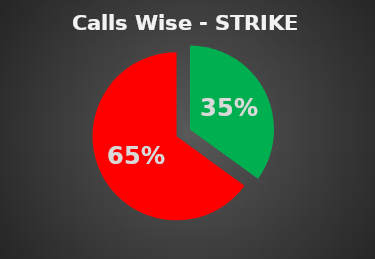
| Category | Series 0 |
|---|---|
| 0 | 0.35 |
| 1 | 0.65 |